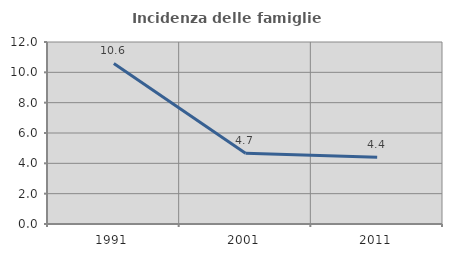
| Category | Incidenza delle famiglie numerose |
|---|---|
| 1991.0 | 10.585 |
| 2001.0 | 4.663 |
| 2011.0 | 4.399 |